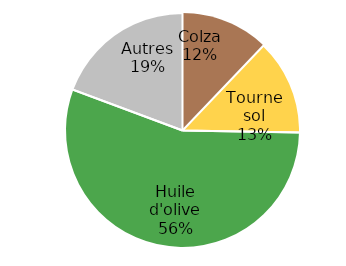
| Category | Series 0 |
|---|---|
| Colza | 22.722 |
| Tournesol | 24.641 |
| Huile d'olive | 103.857 |
| Autres | 36.225 |